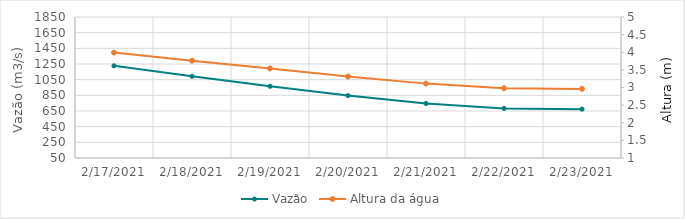
| Category | Vazão |
|---|---|
| 2/17/21 | 1233.4 |
| 2/16/21 | 1394.09 |
| 2/15/21 | 1566.5 |
| 2/14/21 | 1692.13 |
| 2/13/21 | 1750.82 |
| 2/12/21 | 1769.11 |
| 2/11/21 | 1809.4 |